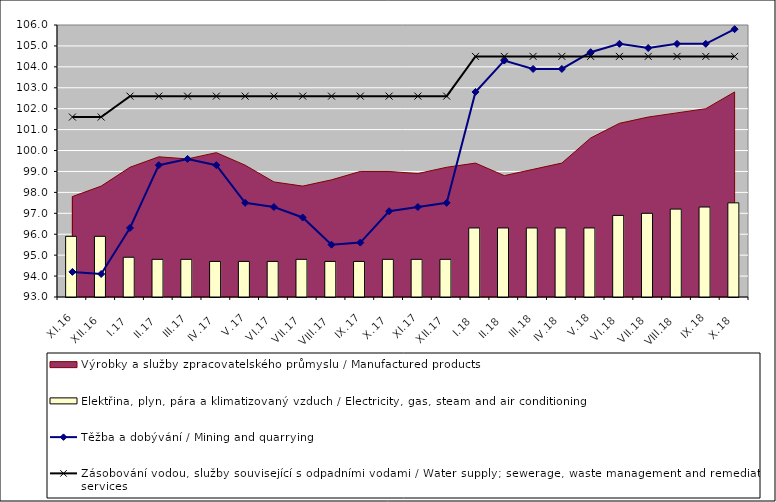
| Category | Elektřina, plyn, pára a klimatizovaný vzduch / Electricity, gas, steam and air conditioning |
|---|---|
| XI.16 | 95.9 |
| XII.16 | 95.9 |
| I.17 | 94.9 |
| II.17 | 94.8 |
| III.17 | 94.8 |
| IV.17 | 94.7 |
| V.17 | 94.7 |
| VI.17 | 94.7 |
| VII.17 | 94.8 |
| VIII.17 | 94.7 |
| IX.17 | 94.7 |
| X.17 | 94.8 |
| XI.17 | 94.8 |
| XII.17 | 94.8 |
| I.18 | 96.3 |
| II.18 | 96.3 |
| III.18 | 96.3 |
| IV.18 | 96.3 |
| V.18 | 96.3 |
| VI.18 | 96.9 |
| VII.18 | 97 |
| VIII.18 | 97.2 |
| IX.18 | 97.3 |
| X.18 | 97.5 |